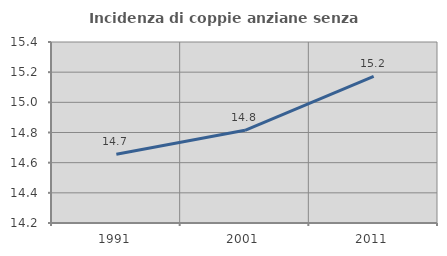
| Category | Incidenza di coppie anziane senza figli  |
|---|---|
| 1991.0 | 14.655 |
| 2001.0 | 14.815 |
| 2011.0 | 15.172 |